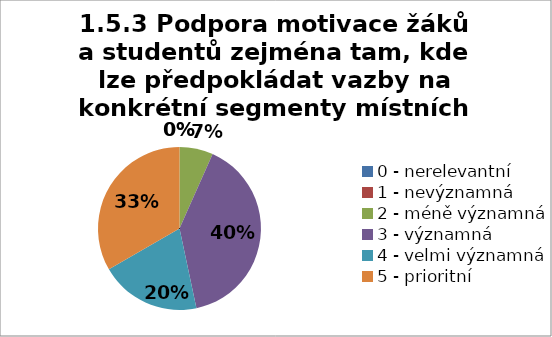
| Category | Series 1 | Series 0 |
|---|---|---|
| 0 - nerelevantní | 0 | 0 |
| 1 - nevýznamná | 0 | 0 |
| 2 - méně významná | 6.667 | 0 |
| 3 - významná | 40 | 33.333 |
| 4 - velmi významná | 20 | 40 |
| 5 - prioritní | 33.333 | 26.667 |